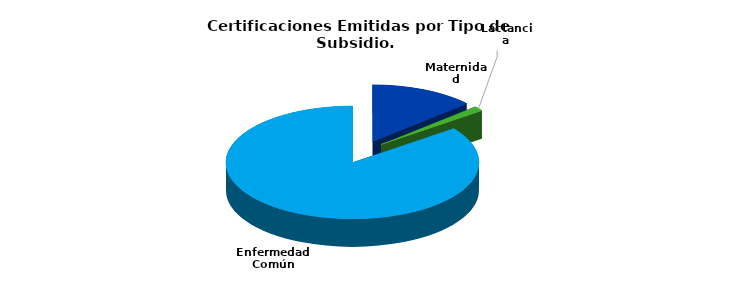
| Category | Total |
|---|---|
| Maternidad | 30 |
| Lactancia | 3 |
| Enfermedad Común | 192 |